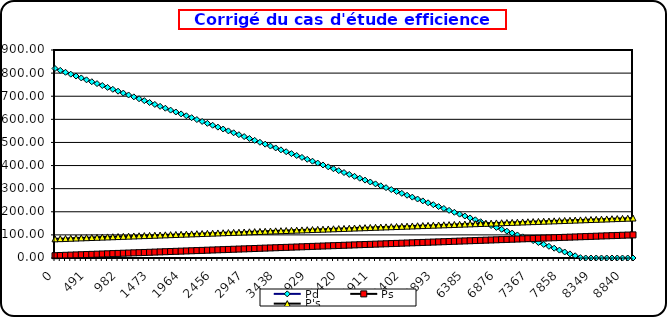
| Category | Pd | Ps | P's |
|---|---|---|---|
| 0.0 | 820 | 10 | 83 |
| 81.8535277187245 | 811.815 | 10.819 | 83.819 |
| 163.707055437449 | 803.629 | 11.637 | 84.637 |
| 245.5605831561735 | 795.444 | 12.456 | 85.456 |
| 327.414110874898 | 787.259 | 13.274 | 86.274 |
| 409.26763859362245 | 779.073 | 14.093 | 87.093 |
| 491.12116631234693 | 770.888 | 14.911 | 87.911 |
| 572.9746940310714 | 762.703 | 15.73 | 88.73 |
| 654.828221749796 | 754.517 | 16.548 | 89.548 |
| 736.6817494685205 | 746.332 | 17.367 | 90.367 |
| 818.535277187245 | 738.146 | 18.185 | 91.185 |
| 900.3888049059696 | 729.961 | 19.004 | 92.004 |
| 982.2423326246941 | 721.776 | 19.822 | 92.822 |
| 1064.0958603434185 | 713.59 | 20.641 | 93.641 |
| 1145.949388062143 | 705.405 | 21.459 | 94.459 |
| 1227.8029157808676 | 697.22 | 22.278 | 95.278 |
| 1309.6564434995921 | 689.034 | 23.097 | 96.097 |
| 1391.5099712183167 | 680.849 | 23.915 | 96.915 |
| 1473.3634989370412 | 672.664 | 24.734 | 97.734 |
| 1555.2170266557657 | 664.478 | 25.552 | 98.552 |
| 1637.0705543744903 | 656.293 | 26.371 | 99.371 |
| 1718.9240820932148 | 648.108 | 27.189 | 100.189 |
| 1800.7776098119393 | 639.922 | 28.008 | 101.008 |
| 1882.6311375306639 | 631.737 | 28.826 | 101.826 |
| 1964.4846652493884 | 623.552 | 29.645 | 102.645 |
| 2046.338192968113 | 615.366 | 30.463 | 103.463 |
| 2128.1917206868375 | 607.181 | 31.282 | 104.282 |
| 2210.045248405562 | 598.995 | 32.1 | 105.1 |
| 2291.898776124286 | 590.81 | 32.919 | 105.919 |
| 2373.7523038430104 | 582.625 | 33.738 | 106.738 |
| 2455.6058315617347 | 574.439 | 34.556 | 107.556 |
| 2537.459359280459 | 566.254 | 35.375 | 108.375 |
| 2619.3128869991833 | 558.069 | 36.193 | 109.193 |
| 2701.1664147179076 | 549.883 | 37.012 | 110.012 |
| 2783.019942436632 | 541.698 | 37.83 | 110.83 |
| 2864.8734701553562 | 533.513 | 38.649 | 111.649 |
| 2946.7269978740806 | 525.327 | 39.467 | 112.467 |
| 3028.580525592805 | 517.142 | 40.286 | 113.286 |
| 3110.434053311529 | 508.957 | 41.104 | 114.104 |
| 3192.2875810302535 | 500.771 | 41.923 | 114.923 |
| 3274.141108748978 | 492.586 | 42.741 | 115.741 |
| 3355.994636467702 | 484.401 | 43.56 | 116.56 |
| 3437.8481641864264 | 476.215 | 44.378 | 117.378 |
| 3519.7016919051507 | 468.03 | 45.197 | 118.197 |
| 3601.555219623875 | 459.844 | 46.016 | 119.016 |
| 3683.4087473425993 | 451.659 | 46.834 | 119.834 |
| 3765.2622750613236 | 443.474 | 47.653 | 120.653 |
| 3847.115802780048 | 435.288 | 48.471 | 121.471 |
| 3928.9693304987723 | 427.103 | 49.29 | 122.29 |
| 4010.8228582174966 | 418.918 | 50.108 | 123.108 |
| 4092.676385936221 | 410.732 | 50.927 | 123.927 |
| 4174.529913654946 | 402.547 | 51.745 | 124.745 |
| 4256.38344137367 | 394.362 | 52.564 | 125.564 |
| 4338.236969092395 | 386.176 | 53.382 | 126.382 |
| 4420.09049681112 | 377.991 | 54.201 | 127.201 |
| 4501.944024529845 | 369.806 | 55.019 | 128.019 |
| 4583.797552248569 | 361.62 | 55.838 | 128.838 |
| 4665.651079967294 | 353.435 | 56.657 | 129.657 |
| 4747.504607686019 | 345.25 | 57.475 | 130.475 |
| 4829.358135404744 | 337.064 | 58.294 | 131.294 |
| 4911.2116631234685 | 328.879 | 59.112 | 132.112 |
| 4993.065190842193 | 320.693 | 59.931 | 132.931 |
| 5074.918718560918 | 312.508 | 60.749 | 133.749 |
| 5156.772246279643 | 304.323 | 61.568 | 134.568 |
| 5238.625773998368 | 296.137 | 62.386 | 135.386 |
| 5320.479301717092 | 287.952 | 63.205 | 136.205 |
| 5402.332829435817 | 279.767 | 64.023 | 137.023 |
| 5484.186357154542 | 271.581 | 64.842 | 137.842 |
| 5566.039884873267 | 263.396 | 65.66 | 138.66 |
| 5647.893412591991 | 255.211 | 66.479 | 139.479 |
| 5729.746940310716 | 247.025 | 67.297 | 140.297 |
| 5811.600468029441 | 238.84 | 68.116 | 141.116 |
| 5893.453995748166 | 230.655 | 68.935 | 141.935 |
| 5975.30752346689 | 222.469 | 69.753 | 142.753 |
| 6057.161051185615 | 214.284 | 70.572 | 143.572 |
| 6139.01457890434 | 206.099 | 71.39 | 144.39 |
| 6220.868106623065 | 197.913 | 72.209 | 145.209 |
| 6302.7216343417895 | 189.728 | 73.027 | 146.027 |
| 6384.575162060514 | 181.542 | 73.846 | 146.846 |
| 6466.428689779239 | 173.357 | 74.664 | 147.664 |
| 6548.282217497964 | 165.172 | 75.483 | 148.483 |
| 6630.1357452166885 | 156.986 | 76.301 | 149.301 |
| 6711.989272935413 | 148.801 | 77.12 | 150.12 |
| 6793.842800654138 | 140.616 | 77.938 | 150.938 |
| 6875.696328372863 | 132.43 | 78.757 | 151.757 |
| 6957.549856091588 | 124.245 | 79.575 | 152.575 |
| 7039.403383810312 | 116.06 | 80.394 | 153.394 |
| 7121.256911529037 | 107.874 | 81.213 | 154.213 |
| 7203.110439247762 | 99.689 | 82.031 | 155.031 |
| 7284.963966966487 | 91.504 | 82.85 | 155.85 |
| 7366.817494685211 | 83.318 | 83.668 | 156.668 |
| 7448.671022403936 | 75.133 | 84.487 | 157.487 |
| 7530.524550122661 | 66.948 | 85.305 | 158.305 |
| 7612.378077841386 | 58.762 | 86.124 | 159.124 |
| 7694.23160556011 | 50.577 | 86.942 | 159.942 |
| 7776.085133278835 | 42.391 | 87.761 | 160.761 |
| 7857.93866099756 | 34.206 | 88.579 | 161.579 |
| 7939.792188716285 | 26.021 | 89.398 | 162.398 |
| 8021.6457164350095 | 17.835 | 90.216 | 163.216 |
| 8103.499244153734 | 9.65 | 91.035 | 164.035 |
| 8185.352771872459 | 1.465 | 91.854 | 164.854 |
| 8267.206299591184 | 0 | 92.672 | 165.672 |
| 8349.059827309908 | 0 | 93.491 | 166.491 |
| 8430.913355028631 | 0 | 94.309 | 167.309 |
| 8512.766882747355 | 0 | 95.128 | 168.128 |
| 8594.62041046608 | 0 | 95.946 | 168.946 |
| 8676.473938184803 | 0 | 96.765 | 169.765 |
| 8758.327465903527 | 0 | 97.583 | 170.583 |
| 8840.18099362225 | 0 | 98.402 | 171.402 |
| 8922.034521340975 | 0 | 99.22 | 172.22 |
| 9003.888049059698 | 0 | 100.039 | 173.039 |